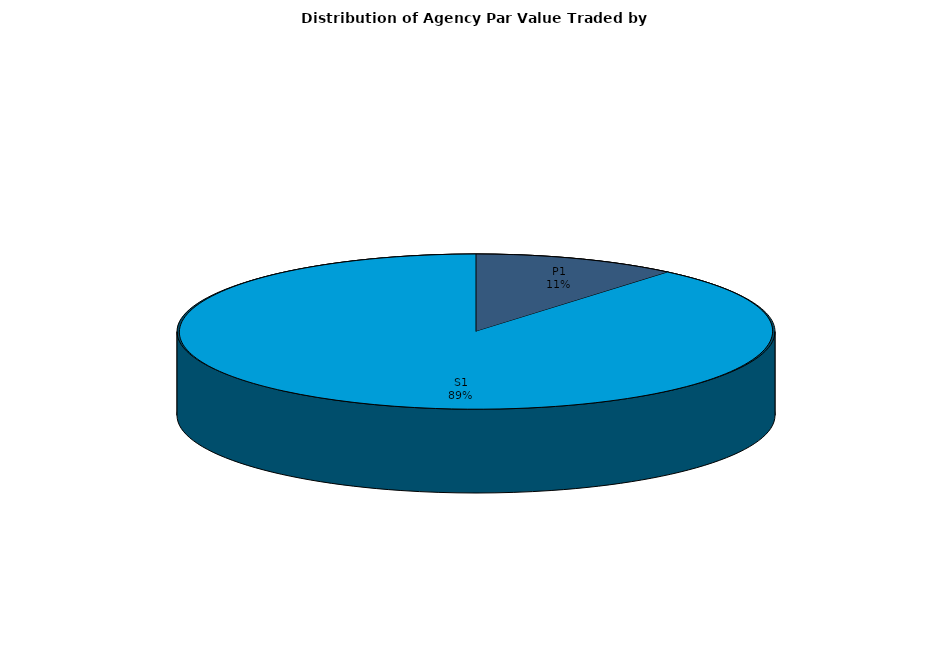
| Category | Series 0 |
|---|---|
| P1 | 436148394.271 |
| S1 | 3490368054.679 |